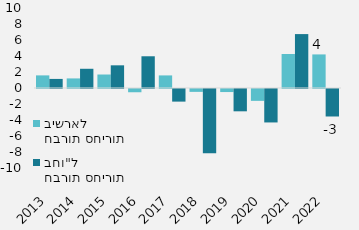
| Category | חברות סחירות בישראל | חברות סחירות בחו"ל |
|---|---|---|
| 2013.0 | 1577 | 1135 |
| 2014.0 | 1197 | 2403 |
| 2015.0 | 1686 | 2835 |
| 2016.0 | -406 | 3966 |
| 2017.0 | 1574 | -1577 |
| 2018.0 | -359 | -8021 |
| 2019.0 | -381 | -2789 |
| 2020.0 | -1482 | -4181 |
| 2021.0 | 4247 | 6739 |
| 2022.0 | 4198 | -3436 |